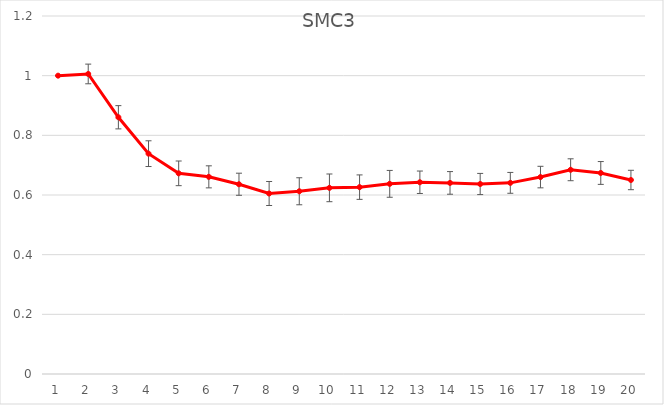
| Category | SMC3 |
|---|---|
| 0 | 1 |
| 1 | 1.006 |
| 2 | 0.861 |
| 3 | 0.739 |
| 4 | 0.673 |
| 5 | 0.661 |
| 6 | 0.636 |
| 7 | 0.605 |
| 8 | 0.613 |
| 9 | 0.624 |
| 10 | 0.626 |
| 11 | 0.637 |
| 12 | 0.643 |
| 13 | 0.641 |
| 14 | 0.637 |
| 15 | 0.641 |
| 16 | 0.66 |
| 17 | 0.685 |
| 18 | 0.674 |
| 19 | 0.65 |